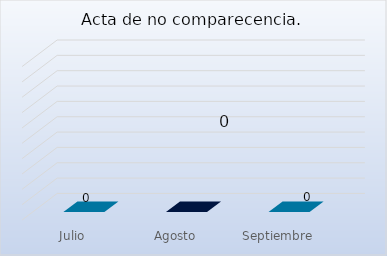
| Category | Acta de no comparecencia. |
|---|---|
| Julio | 0 |
| Agosto | 0 |
| Septiembre | 0 |